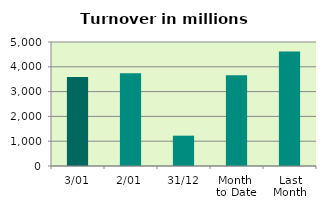
| Category | Series 0 |
|---|---|
| 3/01 | 3585.961 |
| 2/01 | 3735.828 |
| 31/12 | 1222.873 |
| Month 
to Date | 3660.895 |
| Last
Month | 4613.793 |